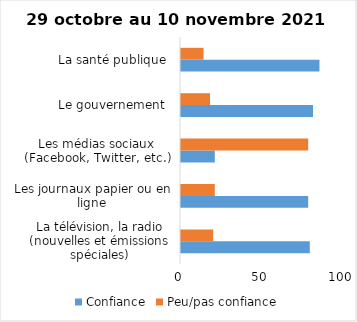
| Category | Confiance | Peu/pas confiance |
|---|---|---|
| La télévision, la radio (nouvelles et émissions spéciales) | 80 | 20 |
| Les journaux papier ou en ligne | 79 | 21 |
| Les médias sociaux (Facebook, Twitter, etc.) | 21 | 79 |
| Le gouvernement  | 82 | 18 |
| La santé publique  | 86 | 14 |